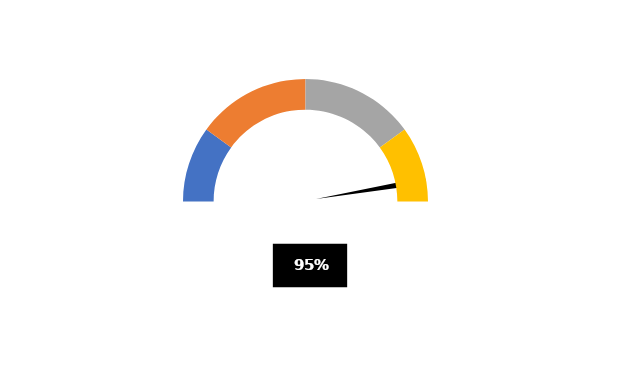
| Category | PUNTERO |
|---|---|
| 0 | 0.468 |
| 1 | 0.01 |
| 2 | 0.522 |